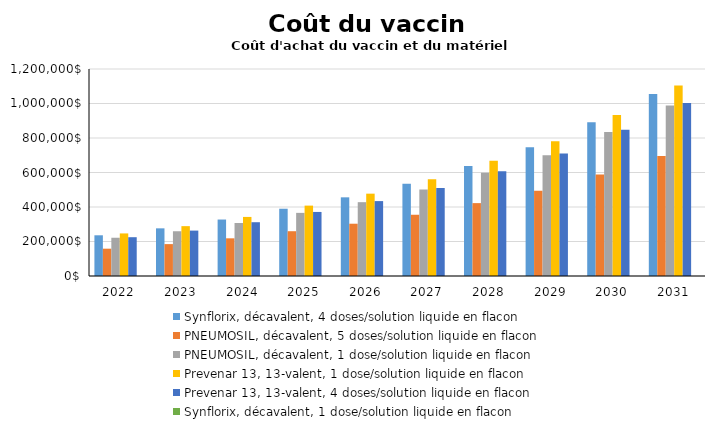
| Category | Synflorix, décavalent, 4 doses/solution liquide en flacon | PNEUMOSIL, décavalent, 5 doses/solution liquide en flacon | PNEUMOSIL, décavalent, 1 dose/solution liquide en flacon | Prevenar 13, 13-valent, 1 dose/solution liquide en flacon | Prevenar 13, 13-valent, 4 doses/solution liquide en flacon | Synflorix, décavalent, 1 dose/solution liquide en flacon |
|---|---|---|---|---|---|---|
| 2022.0 | 236020.522 | 158353.391 | 221732.884 | 246804.379 | 224925.217 | 0 |
| 2023.0 | 276297.231 | 184871.923 | 259478.641 | 288991.372 | 263236.473 | 0 |
| 2024.0 | 327326.119 | 218444.292 | 307296.229 | 342444.047 | 311771.572 | 0 |
| 2025.0 | 389972.507 | 259638.016 | 365996.187 | 408069.075 | 371353.294 | 0 |
| 2026.0 | 456083.084 | 303106.765 | 427941.576 | 477323.405 | 434229.324 | 0 |
| 2027.0 | 535149.945 | 355074.963 | 502023.369 | 560152.837 | 509424.948 | 0 |
| 2028.0 | 637792.028 | 422505.957 | 598188.024 | 667683.879 | 607036.875 | 0 |
| 2029.0 | 746111.001 | 493663.242 | 699670.737 | 781162.645 | 710047.036 | 0 |
| 2030.0 | 890975.356 | 588788.565 | 835385.105 | 932933.121 | 847805.815 | 0 |
| 2031.0 | 1054373.028 | 696070.852 | 988459.795 | 1104122.252 | 1003187.002 | 0 |